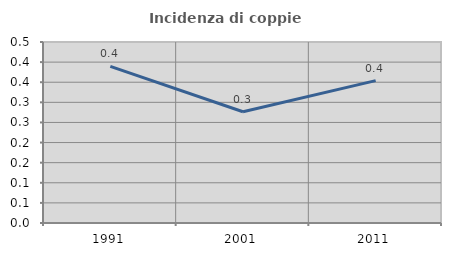
| Category | Incidenza di coppie miste |
|---|---|
| 1991.0 | 0.39 |
| 2001.0 | 0.277 |
| 2011.0 | 0.354 |